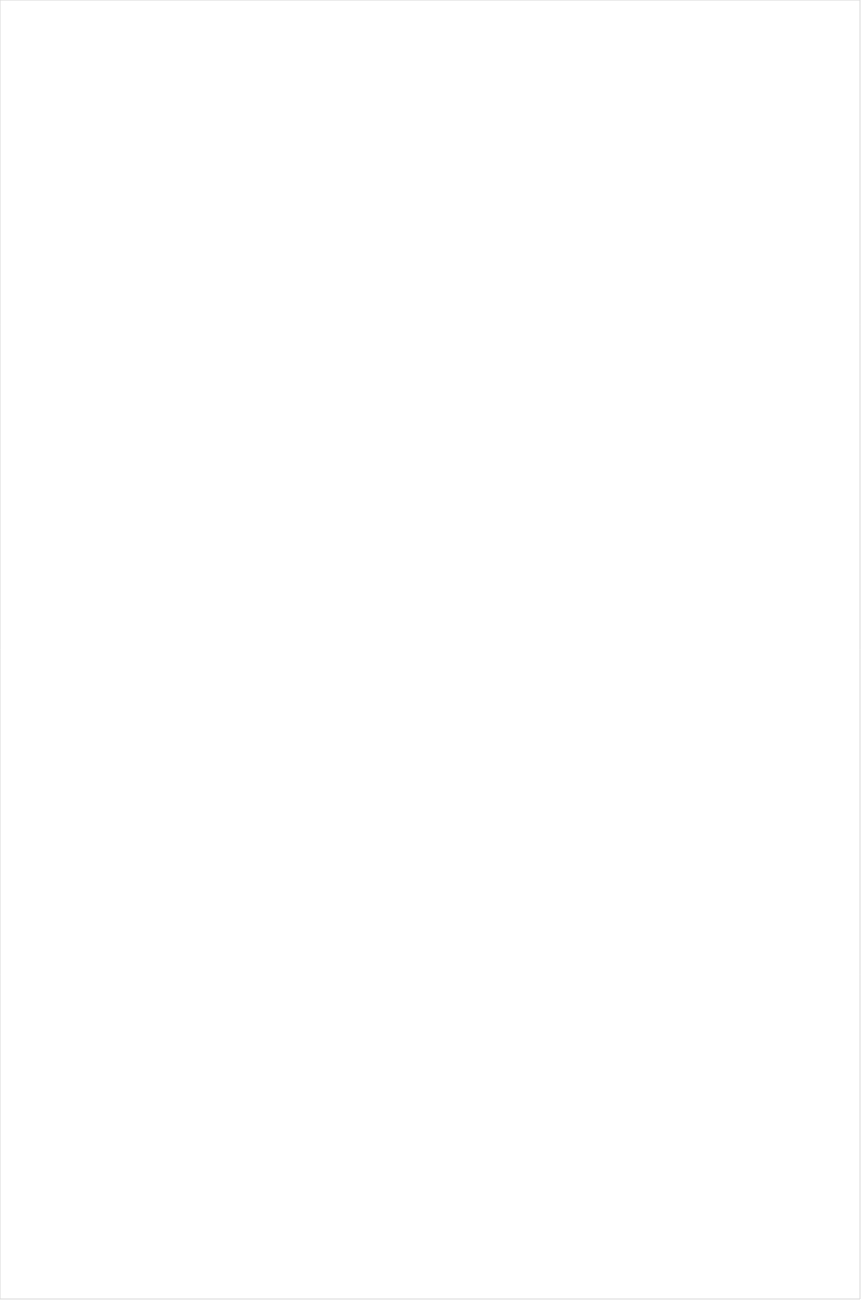
| Category | Total |
|---|---|
| Cartoon Network | -0.577 |
| BET | -0.543 |
| VH1 | -0.528 |
| MTV2 | -0.504 |
| Lifetime Movies | -0.475 |
| TV ONE | -0.448 |
| BET Her | -0.444 |
| Oprah Winfrey Network | -0.402 |
| Disney XD | -0.349 |
| Discovery Life Channel | -0.33 |
| UniMas | -0.323 |
| Nick Toons | -0.318 |
| Univision | -0.308 |
| TLC | -0.295 |
| Nick | -0.283 |
| UP TV | -0.268 |
| Travel | -0.257 |
| WE TV | -0.256 |
| Adult Swim | -0.256 |
| Telemundo | -0.244 |
| Teen Nick | -0.242 |
| Lifetime | -0.236 |
| Nick Jr. | -0.207 |
| MyNetworkTV | -0.203 |
| Disney Channel | -0.186 |
| Logo | -0.183 |
| Hallmark Movies & Mysteries | -0.182 |
| ION | -0.177 |
| Investigation Discovery | -0.154 |
| Hallmark | -0.153 |
| Disney Junior US | -0.132 |
| CW | -0.127 |
| Discovery Family Channel | -0.127 |
| BRAVO | -0.116 |
| TUDN | -0.111 |
| Nick@Nite | -0.101 |
| OXYGEN | -0.095 |
| Galavision | -0.083 |
| E! | -0.078 |
| Headline News | -0.075 |
| SYFY | -0.073 |
| Freeform | -0.071 |
| CMTV | -0.071 |
| Universal Kids | -0.065 |
| NBC Universo | -0.058 |
| FOX | -0.053 |
| MTV | -0.012 |
| PBS | 0.015 |
| Great American Country | 0.016 |
| Discovery Channel | 0.029 |
| A&E | 0.032 |
| CBS | 0.036 |
| HGTV | 0.036 |
| NBC | 0.042 |
| Science Channel | 0.049 |
| FX Movie Channel | 0.049 |
| INSP | 0.061 |
| Motor Trend Network | 0.065 |
| POP | 0.068 |
| History Channel | 0.08 |
| FX | 0.088 |
| Animal Planet | 0.093 |
| MSNBC | 0.111 |
| FXX | 0.136 |
| ABC | 0.158 |
| National Geographic Wild | 0.165 |
| Destination America | 0.171 |
| Weather Channel | 0.19 |
| TBS | 0.193 |
| TNT | 0.198 |
| USA Network | 0.206 |
| Ovation | 0.207 |
| WGN America | 0.226 |
| FYI | 0.229 |
| National Geographic | 0.232 |
| Paramount Network | 0.242 |
| Food Network | 0.244 |
| CNN | 0.255 |
| TV LAND | 0.262 |
| BBC America | 0.267 |
| DIY | 0.269 |
| Fox Business | 0.331 |
| Reelz Channel | 0.351 |
| CNBC | 0.352 |
| Game Show | 0.355 |
| truTV | 0.364 |
| AMC | 0.375 |
| Fox News | 0.379 |
| Independent Film (IFC) | 0.396 |
| Cooking Channel | 0.399 |
| RFD TV | 0.418 |
| American Heroes Channel | 0.419 |
| SundanceTV | 0.45 |
| Comedy Central | 0.464 |
| Smithsonian | 0.469 |
| Viceland | 0.483 |
| Bloomberg HD | 0.483 |
| Outdoor Channel | 0.499 |
| FXDEP | 0.501 |
| The Sportsman Channel | 0.665 |
| Tennis Channel | 0.926 |
| Olympic Channel | 1.099 |
| FOX Sports 2 | 1.387 |
| ESPN | 1.398 |
| NFL Network | 1.406 |
| ESPN2 | 1.517 |
| NBC Sports | 1.548 |
| ESPNEWS | 1.55 |
| ESPN Deportes | 1.624 |
| CBS Sports | 1.634 |
| NBA TV | 1.674 |
| ESPNU | 1.754 |
| PAC-12 Network | 1.926 |
| Golf | 1.926 |
| Big Ten Network | 1.95 |
| Fox Sports 1 | 2.284 |
| NHL | 2.589 |
| MLB Network | 5.988 |